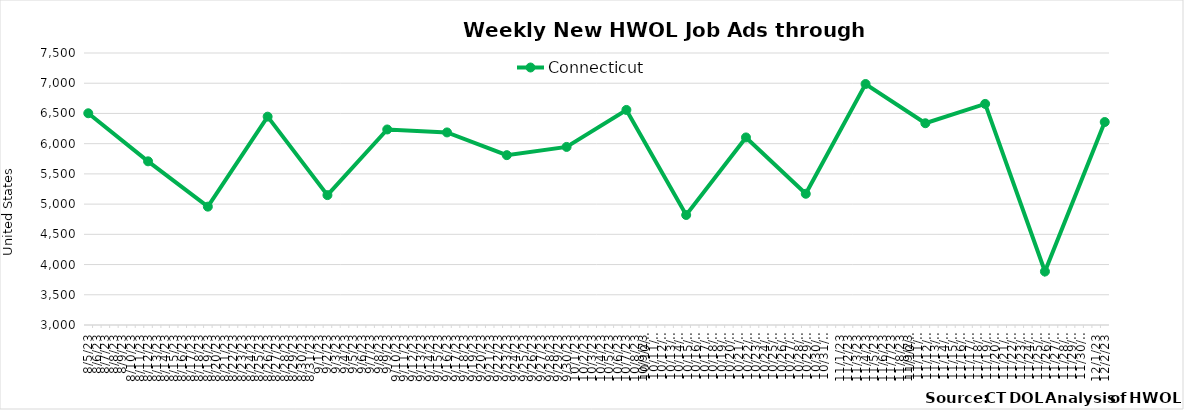
| Category | Connecticut |
|---|---|
| 8/5/23 | 6503 |
| 8/12/23 | 5708 |
| 8/19/23 | 4958 |
| 8/26/23 | 6447 |
| 9/2/23 | 5149 |
| 9/9/23 | 6235 |
| 9/16/23 | 6186 |
| 9/23/23 | 5810 |
| 9/30/23 | 5946 |
| 10/7/23 | 6558 |
| 10/14/23 | 4820 |
| 10/21/23 | 6103 |
| 10/28/23 | 5171 |
| 11/4/23 | 6987 |
| 11/11/23 | 6338 |
| 11/18/23 | 6658 |
| 11/25/23 | 3885 |
| 12/2/23 | 6358 |